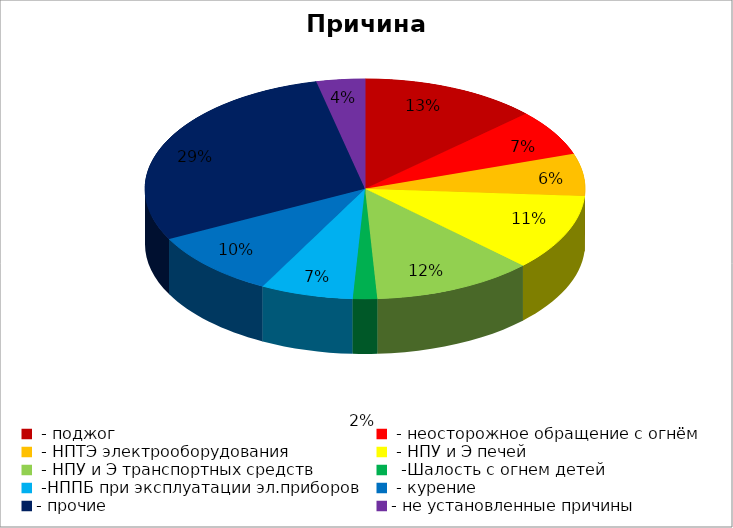
| Category | Причина пожара |
|---|---|
|  - поджог | 44 |
|  - неосторожное обращение с огнём | 23 |
|  - НПТЭ электрооборудования | 21 |
|  - НПУ и Э печей | 38 |
|  - НПУ и Э транспортных средств | 40 |
|   -Шалость с огнем детей | 6 |
|  -НППБ при эксплуатации эл.приборов | 23 |
|  - курение | 33 |
| - прочие | 98 |
| - не установленные причины | 12 |